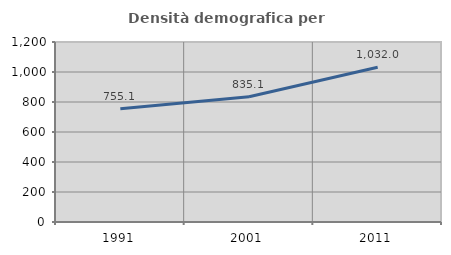
| Category | Densità demografica |
|---|---|
| 1991.0 | 755.053 |
| 2001.0 | 835.053 |
| 2011.0 | 1032.027 |